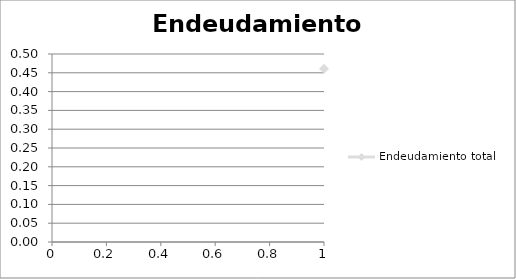
| Category | Endeudamiento total |
|---|---|
| 0 | 0.461 |
| 1 | 0.469 |
| 2 | 0.408 |
| 3 | 0.384 |
| 4 | 0.338 |
| 5 | 0.296 |
| 6 | 0.255 |
| 7 | 0.212 |